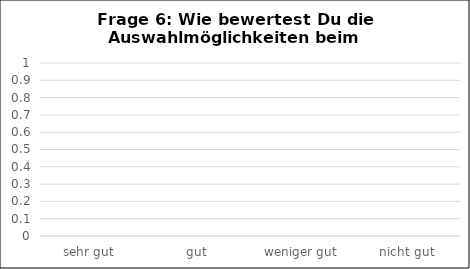
| Category | Series 0 |
|---|---|
| sehr gut  | 0 |
| gut | 0 |
| weniger gut | 0 |
| nicht gut | 0 |